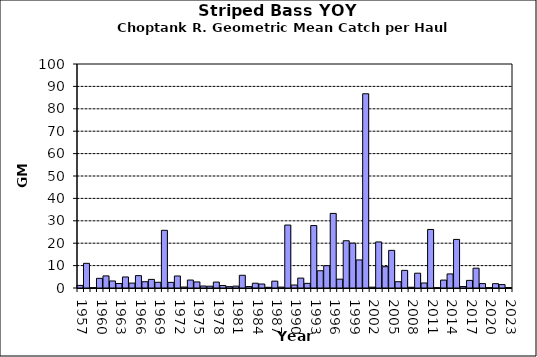
| Category | Series 0 |
|---|---|
| 1957.0 | 1.163 |
| 1958.0 | 11.008 |
| 1959.0 | 0.091 |
| 1960.0 | 4.311 |
| 1961.0 | 5.398 |
| 1962.0 | 3.137 |
| 1963.0 | 2.007 |
| 1964.0 | 4.918 |
| 1965.0 | 2.185 |
| 1966.0 | 5.519 |
| 1967.0 | 2.797 |
| 1968.0 | 3.846 |
| 1969.0 | 2.554 |
| 1970.0 | 25.754 |
| 1971.0 | 2.512 |
| 1972.0 | 5.363 |
| 1973.0 | 0.427 |
| 1974.0 | 3.553 |
| 1975.0 | 2.708 |
| 1976.0 | 0.89 |
| 1977.0 | 0.806 |
| 1978.0 | 2.645 |
| 1979.0 | 1.117 |
| 1980.0 | 0.601 |
| 1981.0 | 0.841 |
| 1982.0 | 5.676 |
| 1983.0 | 0.638 |
| 1984.0 | 2.131 |
| 1985.0 | 1.78 |
| 1986.0 | 0.319 |
| 1987.0 | 3.058 |
| 1988.0 | 0.404 |
| 1989.0 | 28.103 |
| 1990.0 | 1.341 |
| 1991.0 | 4.418 |
| 1992.0 | 2.073 |
| 1993.0 | 27.868 |
| 1994.0 | 7.709 |
| 1995.0 | 9.962 |
| 1996.0 | 33.288 |
| 1997.0 | 3.954 |
| 1998.0 | 21.101 |
| 1999.0 | 20.014 |
| 2000.0 | 12.53 |
| 2001.0 | 86.711 |
| 2002.0 | 0.379 |
| 2003.0 | 20.561 |
| 2004.0 | 9.52 |
| 2005.0 | 16.806 |
| 2006.0 | 2.808 |
| 2007.0 | 7.875 |
| 2008.0 | 0.341 |
| 2009.0 | 6.607 |
| 2010.0 | 2.234 |
| 2011.0 | 26.138 |
| 2012.0 | 0.078 |
| 2013.0 | 3.525 |
| 2014.0 | 6.281 |
| 2015.0 | 21.687 |
| 2016.0 | 0.645 |
| 2017.0 | 3.404 |
| 2018.0 | 8.848 |
| 2019.0 | 1.971 |
| 2020.0 | 0.11 |
| 2021.0 | 1.935 |
| 2022.0 | 1.516 |
| 2023.0 | 0.195 |